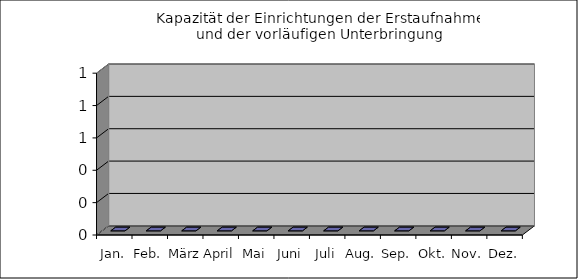
| Category | Kapazität GUs |
|---|---|
| Jan. | 0 |
| Feb. | 0 |
| März | 0 |
| April | 0 |
| Mai | 0 |
| Juni | 0 |
| Juli | 0 |
| Aug. | 0 |
| Sep. | 0 |
| Okt. | 0 |
| Nov. | 0 |
| Dez. | 0 |